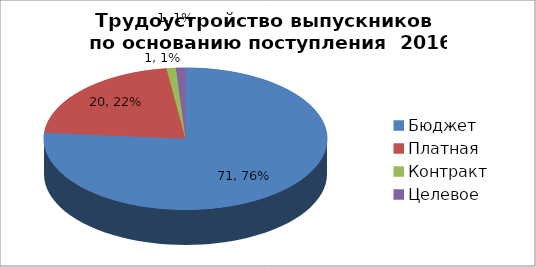
| Category | Series 0 |
|---|---|
| Бюджет | 71 |
| Платная | 20 |
| Контракт | 1 |
| Целевое | 1 |